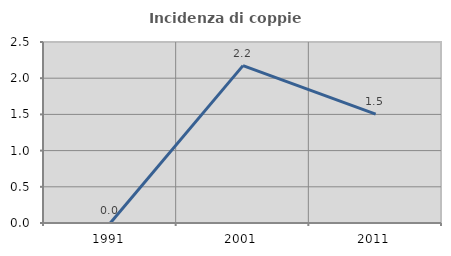
| Category | Incidenza di coppie miste |
|---|---|
| 1991.0 | 0 |
| 2001.0 | 2.174 |
| 2011.0 | 1.504 |